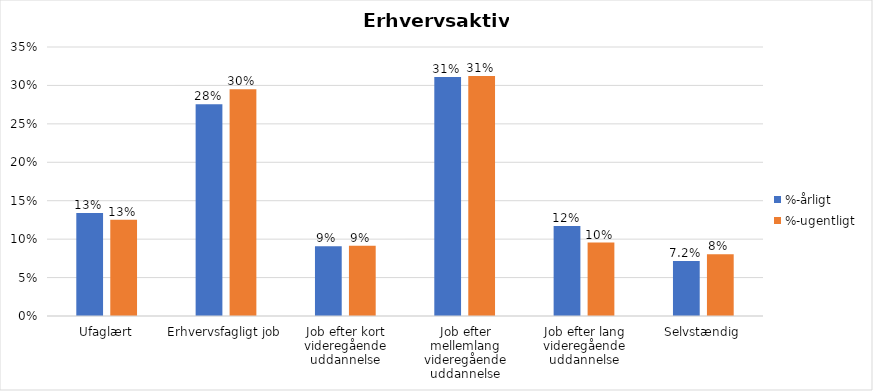
| Category | %-årligt | %-ugentligt |
|---|---|---|
| Ufaglært | 0.134 | 0.125 |
| Erhvervsfagligt job | 0.275 | 0.295 |
| Job efter kort videregående uddannelse | 0.091 | 0.092 |
| Job efter mellemlang videregående uddannelse | 0.311 | 0.312 |
| Job efter lang videregående uddannelse | 0.117 | 0.096 |
| Selvstændig | 0.072 | 0.08 |